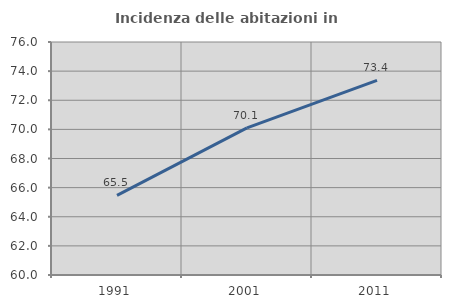
| Category | Incidenza delle abitazioni in proprietà  |
|---|---|
| 1991.0 | 65.471 |
| 2001.0 | 70.108 |
| 2011.0 | 73.365 |